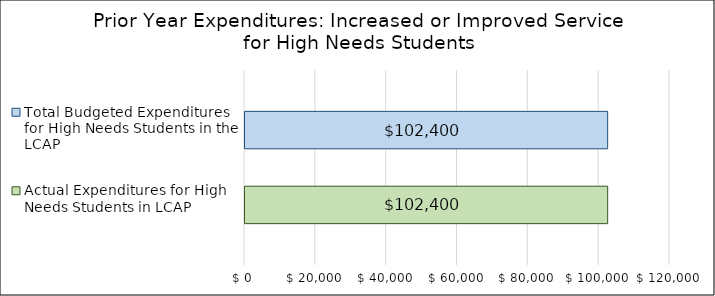
| Category | Actual Expenditures for High Needs Students in LCAP | Total Budgeted Expenditures for High Needs Students in the LCAP |
|---|---|---|
| 0 | 102400 | 102400 |